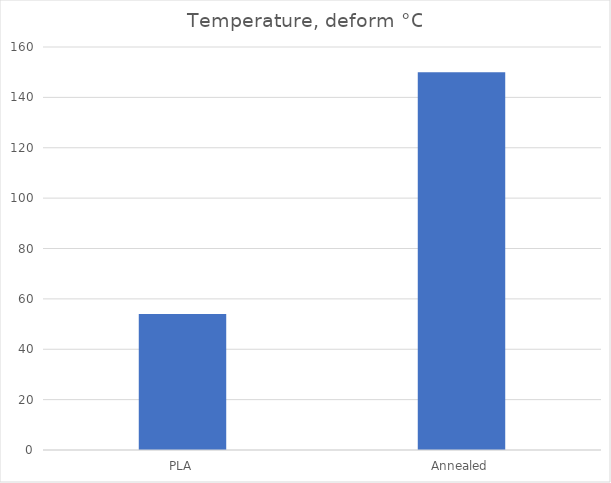
| Category | Deform °C |
|---|---|
| PLA | 54 |
| Annealed | 150 |